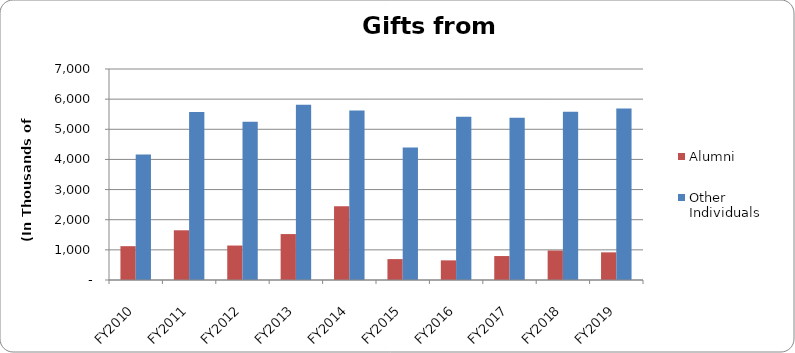
| Category | Alumni | Other Individuals |
|---|---|---|
| FY2010 | 1122.194 | 4166.095 |
| FY2011 | 1649.473 | 5574.336 |
| FY2012 | 1143.234 | 5250.372 |
| FY2013 | 1523.685 | 5812.905 |
| FY2014 | 2445.629 | 5624.761 |
| FY2015 | 693.332 | 4396.563 |
| FY2016 | 651.367 | 5415.398 |
| FY2017 | 794.813 | 5382.726 |
| FY2018 | 978.674 | 5583.379 |
| FY2019 | 917.291 | 5689.171 |